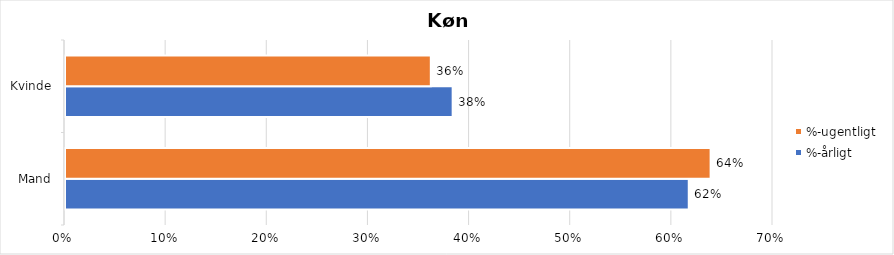
| Category | %-årligt | %-ugentligt |
|---|---|---|
| Mand | 0.617 | 0.638 |
| Kvinde | 0.383 | 0.362 |